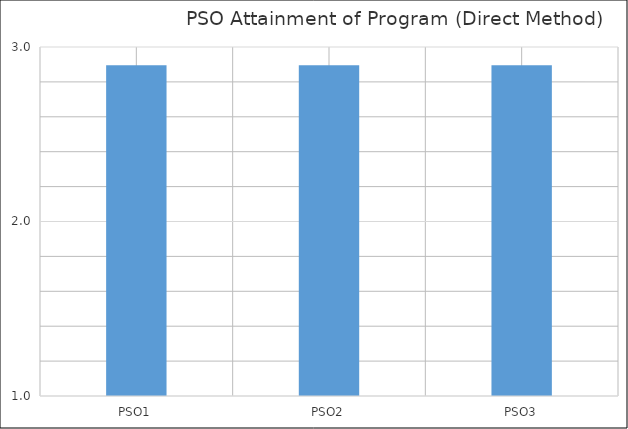
| Category | Series 0 |
|---|---|
| PSO1 | 2.896 |
| PSO2 | 2.896 |
| PSO3 | 2.896 |